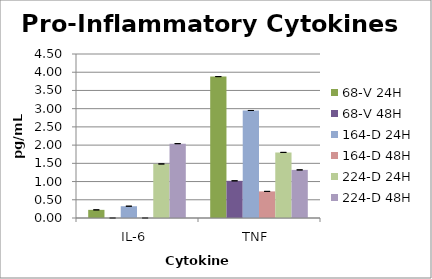
| Category | Series 0 | Series 1 | 68-V 24H | 68-V 48H | Series 4 | Series 5 | 164-D 24H | 164-D 48H | 224-D 24H | 224-D 48H |
|---|---|---|---|---|---|---|---|---|---|---|
| IL-6  |  |  | 0.223 | 0 |  |  | 0.323 | 0 | 1.483 | 2.04 |
| TNF  |  |  | 3.88 | 1.02 |  |  | 2.95 | 0.73 | 1.8 | 1.32 |